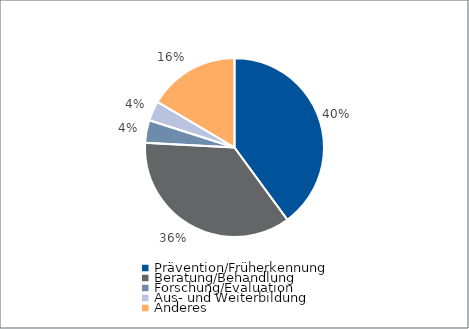
| Category | Series 0 |
|---|---|
| Prävention/Früherkennung | 48401.04 |
| Beratung/Behandlung | 43483.57 |
| Forschung/Evaluation | 4966.65 |
| Aus- und Weiterbildung | 4324.44 |
| Anderes | 20000 |